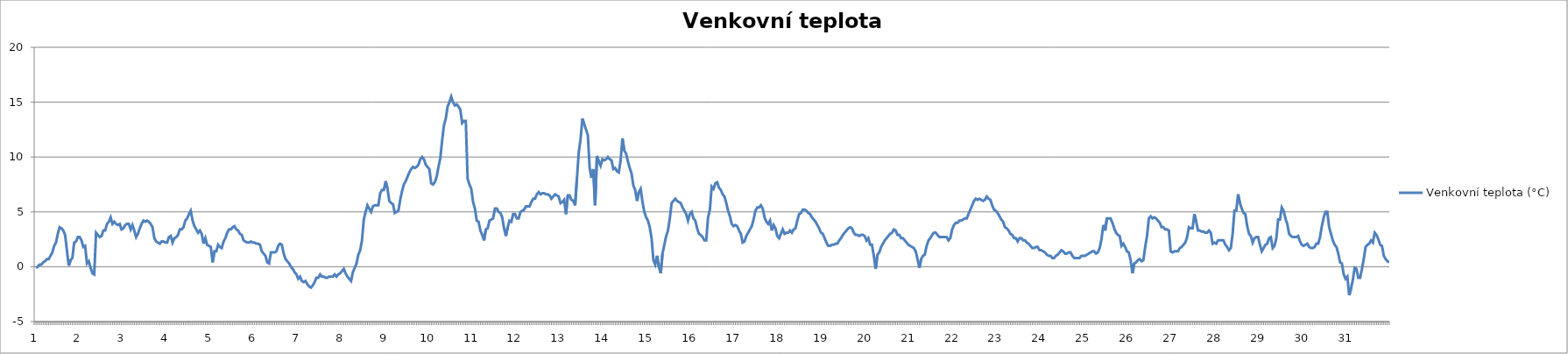
| Category | Venkovní teplota (°C) |
|---|---|
| 0 | -0.1 |
| 1 | 0 |
| 2 | 0.2 |
| 3 | 0.2 |
| 4 | 0.4 |
| 5 | 0.5 |
| 6 | 0.7 |
| 7 | 0.7 |
| 8 | 1 |
| 9 | 1.3 |
| 10 | 1.9 |
| 11 | 2.2 |
| 12 | 3 |
| 13 | 3.6 |
| 14 | 3.5 |
| 15 | 3.3 |
| 16 | 2.9 |
| 17 | 1.5 |
| 18 | 0.1 |
| 19 | 0.6 |
| 20 | 0.8 |
| 21 | 2.2 |
| 22 | 2.3 |
| 23 | 2.7 |
| 24 | 2.7 |
| 25 | 2.4 |
| 26 | 1.8 |
| 27 | 1.9 |
| 28 | 0.3 |
| 29 | 0.5 |
| 30 | -0.1 |
| 31 | -0.6 |
| 32 | -0.7 |
| 33 | 3.1 |
| 34 | 2.9 |
| 35 | 2.7 |
| 36 | 2.8 |
| 37 | 3.3 |
| 38 | 3.3 |
| 39 | 3.9 |
| 40 | 4.1 |
| 41 | 4.5 |
| 42 | 3.9 |
| 43 | 4.1 |
| 44 | 3.9 |
| 45 | 3.8 |
| 46 | 3.9 |
| 47 | 3.4 |
| 48 | 3.5 |
| 49 | 3.8 |
| 50 | 3.9 |
| 51 | 3.9 |
| 52 | 3.4 |
| 53 | 3.8 |
| 54 | 3.3 |
| 55 | 2.7 |
| 56 | 3 |
| 57 | 3.5 |
| 58 | 3.9 |
| 59 | 4.2 |
| 60 | 4.1 |
| 61 | 4.2 |
| 62 | 4.1 |
| 63 | 3.9 |
| 64 | 3.6 |
| 65 | 2.6 |
| 66 | 2.3 |
| 67 | 2.2 |
| 68 | 2.1 |
| 69 | 2.3 |
| 70 | 2.3 |
| 71 | 2.2 |
| 72 | 2.2 |
| 73 | 2.7 |
| 74 | 2.8 |
| 75 | 2.2 |
| 76 | 2.6 |
| 77 | 2.7 |
| 78 | 2.9 |
| 79 | 3.4 |
| 80 | 3.4 |
| 81 | 3.6 |
| 82 | 4.2 |
| 83 | 4.4 |
| 84 | 4.8 |
| 85 | 5.1 |
| 86 | 4.2 |
| 87 | 3.7 |
| 88 | 3.4 |
| 89 | 3.1 |
| 90 | 3.3 |
| 91 | 3 |
| 92 | 2.1 |
| 93 | 2.6 |
| 94 | 2 |
| 95 | 1.9 |
| 96 | 1.8 |
| 97 | 0.4 |
| 98 | 1.4 |
| 99 | 1.4 |
| 100 | 2 |
| 101 | 1.8 |
| 102 | 1.7 |
| 103 | 2.3 |
| 104 | 2.6 |
| 105 | 3.1 |
| 106 | 3.4 |
| 107 | 3.4 |
| 108 | 3.6 |
| 109 | 3.7 |
| 110 | 3.4 |
| 111 | 3.3 |
| 112 | 3 |
| 113 | 2.9 |
| 114 | 2.4 |
| 115 | 2.3 |
| 116 | 2.2 |
| 117 | 2.2 |
| 118 | 2.3 |
| 119 | 2.2 |
| 120 | 2.2 |
| 121 | 2.1 |
| 122 | 2.1 |
| 123 | 2 |
| 124 | 1.4 |
| 125 | 1.2 |
| 126 | 1 |
| 127 | 0.4 |
| 128 | 0.3 |
| 129 | 1.3 |
| 130 | 1.3 |
| 131 | 1.3 |
| 132 | 1.4 |
| 133 | 1.9 |
| 134 | 2.1 |
| 135 | 2 |
| 136 | 1.2 |
| 137 | 0.7 |
| 138 | 0.5 |
| 139 | 0.3 |
| 140 | 0 |
| 141 | -0.2 |
| 142 | -0.5 |
| 143 | -0.7 |
| 144 | -1.1 |
| 145 | -0.9 |
| 146 | -1.3 |
| 147 | -1.4 |
| 148 | -1.3 |
| 149 | -1.6 |
| 150 | -1.8 |
| 151 | -1.9 |
| 152 | -1.7 |
| 153 | -1.4 |
| 154 | -1 |
| 155 | -1 |
| 156 | -0.7 |
| 157 | -0.9 |
| 158 | -0.9 |
| 159 | -1 |
| 160 | -1 |
| 161 | -0.9 |
| 162 | -0.9 |
| 163 | -0.9 |
| 164 | -0.7 |
| 165 | -0.9 |
| 166 | -0.7 |
| 167 | -0.6 |
| 168 | -0.4 |
| 169 | -0.2 |
| 170 | -0.6 |
| 171 | -0.9 |
| 172 | -1.1 |
| 173 | -1.3 |
| 174 | -0.5 |
| 175 | -0.1 |
| 176 | 0.3 |
| 177 | 1.1 |
| 178 | 1.5 |
| 179 | 2.4 |
| 180 | 4.3 |
| 181 | 5 |
| 182 | 5.6 |
| 183 | 5.3 |
| 184 | 5 |
| 185 | 5.5 |
| 186 | 5.6 |
| 187 | 5.6 |
| 188 | 5.6 |
| 189 | 6.7 |
| 190 | 7 |
| 191 | 7 |
| 192 | 7.8 |
| 193 | 7.1 |
| 194 | 6 |
| 195 | 5.8 |
| 196 | 5.7 |
| 197 | 4.9 |
| 198 | 5 |
| 199 | 5.1 |
| 200 | 6.1 |
| 201 | 6.9 |
| 202 | 7.5 |
| 203 | 7.8 |
| 204 | 8.2 |
| 205 | 8.6 |
| 206 | 8.9 |
| 207 | 9.1 |
| 208 | 9 |
| 209 | 9.1 |
| 210 | 9.3 |
| 211 | 9.8 |
| 212 | 10 |
| 213 | 9.8 |
| 214 | 9.3 |
| 215 | 9.1 |
| 216 | 8.9 |
| 217 | 7.6 |
| 218 | 7.5 |
| 219 | 7.7 |
| 220 | 8.2 |
| 221 | 9.1 |
| 222 | 9.9 |
| 223 | 11.5 |
| 224 | 12.9 |
| 225 | 13.5 |
| 226 | 14.6 |
| 227 | 15 |
| 228 | 15.5 |
| 229 | 15 |
| 230 | 14.7 |
| 231 | 14.8 |
| 232 | 14.6 |
| 233 | 14.3 |
| 234 | 13.1 |
| 235 | 13.3 |
| 236 | 13.3 |
| 237 | 8 |
| 238 | 7.5 |
| 239 | 7.1 |
| 240 | 5.9 |
| 241 | 5.3 |
| 242 | 4.2 |
| 243 | 4.1 |
| 244 | 3.3 |
| 245 | 2.9 |
| 246 | 2.4 |
| 247 | 3.4 |
| 248 | 3.5 |
| 249 | 4.2 |
| 250 | 4.3 |
| 251 | 4.4 |
| 252 | 5.3 |
| 253 | 5.3 |
| 254 | 5 |
| 255 | 4.9 |
| 256 | 4.5 |
| 257 | 3.5 |
| 258 | 2.8 |
| 259 | 3.6 |
| 260 | 4.2 |
| 261 | 4.1 |
| 262 | 4.8 |
| 263 | 4.8 |
| 264 | 4.4 |
| 265 | 4.4 |
| 266 | 5 |
| 267 | 5.1 |
| 268 | 5.2 |
| 269 | 5.5 |
| 270 | 5.5 |
| 271 | 5.5 |
| 272 | 5.9 |
| 273 | 6.2 |
| 274 | 6.2 |
| 275 | 6.6 |
| 276 | 6.8 |
| 277 | 6.6 |
| 278 | 6.7 |
| 279 | 6.7 |
| 280 | 6.6 |
| 281 | 6.6 |
| 282 | 6.5 |
| 283 | 6.2 |
| 284 | 6.4 |
| 285 | 6.6 |
| 286 | 6.5 |
| 287 | 6.4 |
| 288 | 5.8 |
| 289 | 5.9 |
| 290 | 6.1 |
| 291 | 4.8 |
| 292 | 6.5 |
| 293 | 6.5 |
| 294 | 6.1 |
| 295 | 6 |
| 296 | 5.6 |
| 297 | 8 |
| 298 | 10.4 |
| 299 | 11.6 |
| 300 | 13.5 |
| 301 | 13 |
| 302 | 12.5 |
| 303 | 12 |
| 304 | 9 |
| 305 | 8.1 |
| 306 | 8.9 |
| 307 | 5.6 |
| 308 | 10.1 |
| 309 | 9.6 |
| 310 | 9.2 |
| 311 | 9.8 |
| 312 | 9.7 |
| 313 | 9.8 |
| 314 | 10 |
| 315 | 9.8 |
| 316 | 9.7 |
| 317 | 8.9 |
| 318 | 9 |
| 319 | 8.7 |
| 320 | 8.6 |
| 321 | 9.7 |
| 322 | 11.7 |
| 323 | 10.6 |
| 324 | 10.3 |
| 325 | 9.6 |
| 326 | 9 |
| 327 | 8.5 |
| 328 | 7.4 |
| 329 | 7 |
| 330 | 6 |
| 331 | 6.8 |
| 332 | 7.1 |
| 333 | 5.9 |
| 334 | 5 |
| 335 | 4.5 |
| 336 | 4.2 |
| 337 | 3.6 |
| 338 | 2.6 |
| 339 | 0.6 |
| 340 | 0.2 |
| 341 | 1 |
| 342 | 0 |
| 343 | -0.6 |
| 344 | 1.2 |
| 345 | 2 |
| 346 | 2.8 |
| 347 | 3.3 |
| 348 | 4.4 |
| 349 | 5.8 |
| 350 | 6 |
| 351 | 6.2 |
| 352 | 6 |
| 353 | 5.9 |
| 354 | 5.8 |
| 355 | 5.4 |
| 356 | 5.1 |
| 357 | 4.8 |
| 358 | 4.2 |
| 359 | 4.8 |
| 360 | 5 |
| 361 | 4.4 |
| 362 | 4.2 |
| 363 | 3.5 |
| 364 | 3 |
| 365 | 2.9 |
| 366 | 2.7 |
| 367 | 2.4 |
| 368 | 2.4 |
| 369 | 4.5 |
| 370 | 5.2 |
| 371 | 7.3 |
| 372 | 7.1 |
| 373 | 7.6 |
| 374 | 7.7 |
| 375 | 7.2 |
| 376 | 7 |
| 377 | 6.6 |
| 378 | 6.4 |
| 379 | 5.8 |
| 380 | 5.1 |
| 381 | 4.6 |
| 382 | 3.9 |
| 383 | 3.7 |
| 384 | 3.8 |
| 385 | 3.7 |
| 386 | 3.3 |
| 387 | 3 |
| 388 | 2.2 |
| 389 | 2.3 |
| 390 | 2.8 |
| 391 | 3.1 |
| 392 | 3.4 |
| 393 | 3.7 |
| 394 | 4.3 |
| 395 | 5.1 |
| 396 | 5.4 |
| 397 | 5.4 |
| 398 | 5.6 |
| 399 | 5.3 |
| 400 | 4.5 |
| 401 | 4.1 |
| 402 | 3.9 |
| 403 | 4.2 |
| 404 | 3.3 |
| 405 | 3.8 |
| 406 | 3.5 |
| 407 | 2.8 |
| 408 | 2.6 |
| 409 | 3 |
| 410 | 3.4 |
| 411 | 3 |
| 412 | 3.1 |
| 413 | 3.1 |
| 414 | 3.3 |
| 415 | 3.1 |
| 416 | 3.4 |
| 417 | 3.5 |
| 418 | 4.2 |
| 419 | 4.8 |
| 420 | 4.9 |
| 421 | 5.2 |
| 422 | 5.2 |
| 423 | 5.1 |
| 424 | 4.9 |
| 425 | 4.8 |
| 426 | 4.5 |
| 427 | 4.3 |
| 428 | 4.1 |
| 429 | 3.8 |
| 430 | 3.5 |
| 431 | 3.1 |
| 432 | 3 |
| 433 | 2.6 |
| 434 | 2.2 |
| 435 | 1.9 |
| 436 | 1.9 |
| 437 | 2 |
| 438 | 2 |
| 439 | 2.1 |
| 440 | 2.1 |
| 441 | 2.4 |
| 442 | 2.6 |
| 443 | 2.9 |
| 444 | 3.1 |
| 445 | 3.3 |
| 446 | 3.5 |
| 447 | 3.6 |
| 448 | 3.5 |
| 449 | 3.1 |
| 450 | 2.9 |
| 451 | 2.9 |
| 452 | 2.8 |
| 453 | 2.9 |
| 454 | 2.9 |
| 455 | 2.8 |
| 456 | 2.4 |
| 457 | 2.6 |
| 458 | 2 |
| 459 | 2 |
| 460 | 1 |
| 461 | -0.2 |
| 462 | 1.1 |
| 463 | 1.3 |
| 464 | 1.8 |
| 465 | 2.1 |
| 466 | 2.4 |
| 467 | 2.6 |
| 468 | 2.8 |
| 469 | 3 |
| 470 | 3.1 |
| 471 | 3.4 |
| 472 | 3.3 |
| 473 | 2.9 |
| 474 | 2.9 |
| 475 | 2.6 |
| 476 | 2.6 |
| 477 | 2.4 |
| 478 | 2.2 |
| 479 | 2 |
| 480 | 1.9 |
| 481 | 1.8 |
| 482 | 1.7 |
| 483 | 1.4 |
| 484 | 0.7 |
| 485 | -0.1 |
| 486 | 0.7 |
| 487 | 1 |
| 488 | 1.1 |
| 489 | 1.9 |
| 490 | 2.4 |
| 491 | 2.6 |
| 492 | 2.9 |
| 493 | 3.1 |
| 494 | 3.1 |
| 495 | 2.9 |
| 496 | 2.7 |
| 497 | 2.7 |
| 498 | 2.7 |
| 499 | 2.7 |
| 500 | 2.7 |
| 501 | 2.4 |
| 502 | 2.6 |
| 503 | 3.4 |
| 504 | 3.8 |
| 505 | 4 |
| 506 | 4 |
| 507 | 4.2 |
| 508 | 4.2 |
| 509 | 4.3 |
| 510 | 4.4 |
| 511 | 4.4 |
| 512 | 4.8 |
| 513 | 5.2 |
| 514 | 5.6 |
| 515 | 6 |
| 516 | 6.2 |
| 517 | 6.1 |
| 518 | 6.2 |
| 519 | 6.1 |
| 520 | 6 |
| 521 | 6.1 |
| 522 | 6.4 |
| 523 | 6.2 |
| 524 | 6.1 |
| 525 | 5.6 |
| 526 | 5.2 |
| 527 | 5.1 |
| 528 | 4.9 |
| 529 | 4.6 |
| 530 | 4.3 |
| 531 | 4.1 |
| 532 | 3.6 |
| 533 | 3.5 |
| 534 | 3.3 |
| 535 | 3 |
| 536 | 2.9 |
| 537 | 2.6 |
| 538 | 2.6 |
| 539 | 2.3 |
| 540 | 2.6 |
| 541 | 2.6 |
| 542 | 2.4 |
| 543 | 2.4 |
| 544 | 2.2 |
| 545 | 2.1 |
| 546 | 1.9 |
| 547 | 1.7 |
| 548 | 1.7 |
| 549 | 1.8 |
| 550 | 1.8 |
| 551 | 1.5 |
| 552 | 1.5 |
| 553 | 1.4 |
| 554 | 1.3 |
| 555 | 1.1 |
| 556 | 1 |
| 557 | 1 |
| 558 | 0.8 |
| 559 | 0.8 |
| 560 | 1 |
| 561 | 1.1 |
| 562 | 1.3 |
| 563 | 1.5 |
| 564 | 1.4 |
| 565 | 1.2 |
| 566 | 1.2 |
| 567 | 1.3 |
| 568 | 1.3 |
| 569 | 1 |
| 570 | 0.8 |
| 571 | 0.8 |
| 572 | 0.8 |
| 573 | 0.8 |
| 574 | 1 |
| 575 | 1 |
| 576 | 1 |
| 577 | 1.1 |
| 578 | 1.2 |
| 579 | 1.3 |
| 580 | 1.4 |
| 581 | 1.4 |
| 582 | 1.2 |
| 583 | 1.3 |
| 584 | 1.7 |
| 585 | 2.5 |
| 586 | 3.8 |
| 587 | 3.3 |
| 588 | 4.4 |
| 589 | 4.4 |
| 590 | 4.4 |
| 591 | 4 |
| 592 | 3.5 |
| 593 | 3.1 |
| 594 | 2.9 |
| 595 | 2.8 |
| 596 | 1.9 |
| 597 | 2.1 |
| 598 | 1.8 |
| 599 | 1.4 |
| 600 | 1.3 |
| 601 | 0.6 |
| 602 | -0.6 |
| 603 | 0.3 |
| 604 | 0.4 |
| 605 | 0.6 |
| 606 | 0.7 |
| 607 | 0.5 |
| 608 | 0.6 |
| 609 | 1.8 |
| 610 | 2.8 |
| 611 | 4.4 |
| 612 | 4.6 |
| 613 | 4.4 |
| 614 | 4.5 |
| 615 | 4.4 |
| 616 | 4.2 |
| 617 | 4 |
| 618 | 3.6 |
| 619 | 3.6 |
| 620 | 3.4 |
| 621 | 3.4 |
| 622 | 3.3 |
| 623 | 1.4 |
| 624 | 1.3 |
| 625 | 1.4 |
| 626 | 1.4 |
| 627 | 1.4 |
| 628 | 1.7 |
| 629 | 1.8 |
| 630 | 2 |
| 631 | 2.2 |
| 632 | 2.7 |
| 633 | 3.6 |
| 634 | 3.5 |
| 635 | 3.5 |
| 636 | 4.8 |
| 637 | 4.1 |
| 638 | 3.3 |
| 639 | 3.3 |
| 640 | 3.2 |
| 641 | 3.2 |
| 642 | 3.1 |
| 643 | 3.1 |
| 644 | 3.3 |
| 645 | 3.1 |
| 646 | 2.1 |
| 647 | 2.2 |
| 648 | 2.1 |
| 649 | 2.4 |
| 650 | 2.4 |
| 651 | 2.4 |
| 652 | 2.4 |
| 653 | 2 |
| 654 | 1.8 |
| 655 | 1.5 |
| 656 | 1.7 |
| 657 | 3 |
| 658 | 5.1 |
| 659 | 5.1 |
| 660 | 6.6 |
| 661 | 5.8 |
| 662 | 5.3 |
| 663 | 4.9 |
| 664 | 4.8 |
| 665 | 3.7 |
| 666 | 3 |
| 667 | 2.8 |
| 668 | 2.2 |
| 669 | 2.6 |
| 670 | 2.7 |
| 671 | 2.7 |
| 672 | 2 |
| 673 | 1.4 |
| 674 | 1.7 |
| 675 | 2 |
| 676 | 2.1 |
| 677 | 2.6 |
| 678 | 2.7 |
| 679 | 1.7 |
| 680 | 1.9 |
| 681 | 2.6 |
| 682 | 4.3 |
| 683 | 4.3 |
| 684 | 5.4 |
| 685 | 5.1 |
| 686 | 4.4 |
| 687 | 3.9 |
| 688 | 3 |
| 689 | 2.8 |
| 690 | 2.7 |
| 691 | 2.7 |
| 692 | 2.7 |
| 693 | 2.8 |
| 694 | 2.3 |
| 695 | 2 |
| 696 | 1.9 |
| 697 | 2 |
| 698 | 2.1 |
| 699 | 1.8 |
| 700 | 1.7 |
| 701 | 1.7 |
| 702 | 1.8 |
| 703 | 2.1 |
| 704 | 2.1 |
| 705 | 2.7 |
| 706 | 3.7 |
| 707 | 4.5 |
| 708 | 5 |
| 709 | 5 |
| 710 | 3.6 |
| 711 | 3 |
| 712 | 2.4 |
| 713 | 2 |
| 714 | 1.8 |
| 715 | 1.2 |
| 716 | 0.4 |
| 717 | 0.3 |
| 718 | -0.7 |
| 719 | -1.1 |
| 720 | -0.9 |
| 721 | -2.6 |
| 722 | -2 |
| 723 | -1.2 |
| 724 | -0.1 |
| 725 | -0.2 |
| 726 | -1 |
| 727 | -1 |
| 728 | -0.2 |
| 729 | 0.7 |
| 730 | 1.8 |
| 731 | 2 |
| 732 | 2.1 |
| 733 | 2.4 |
| 734 | 2.2 |
| 735 | 3.1 |
| 736 | 2.9 |
| 737 | 2.5 |
| 738 | 2 |
| 739 | 1.9 |
| 740 | 1 |
| 741 | 0.7 |
| 742 | 0.5 |
| 743 | 0.4 |